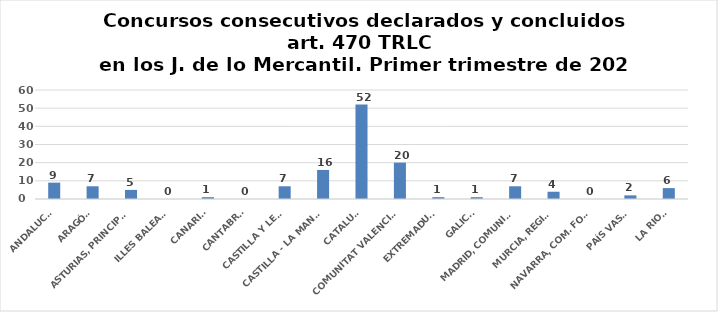
| Category | Consecutivos declarados y concluidos |
|---|---|
| ANDALUCÍA | 9 |
| ARAGÓN | 7 |
| ASTURIAS, PRINCIPADO | 5 |
| ILLES BALEARS | 0 |
| CANARIAS | 1 |
| CANTABRIA | 0 |
| CASTILLA Y LEÓN | 7 |
| CASTILLA - LA MANCHA | 16 |
| CATALUÑA | 52 |
| COMUNITAT VALENCIANA | 20 |
| EXTREMADURA | 1 |
| GALICIA | 1 |
| MADRID, COMUNIDAD | 7 |
| MURCIA, REGIÓN | 4 |
| NAVARRA, COM. FORAL | 0 |
| PAÍS VASCO | 2 |
| LA RIOJA | 6 |